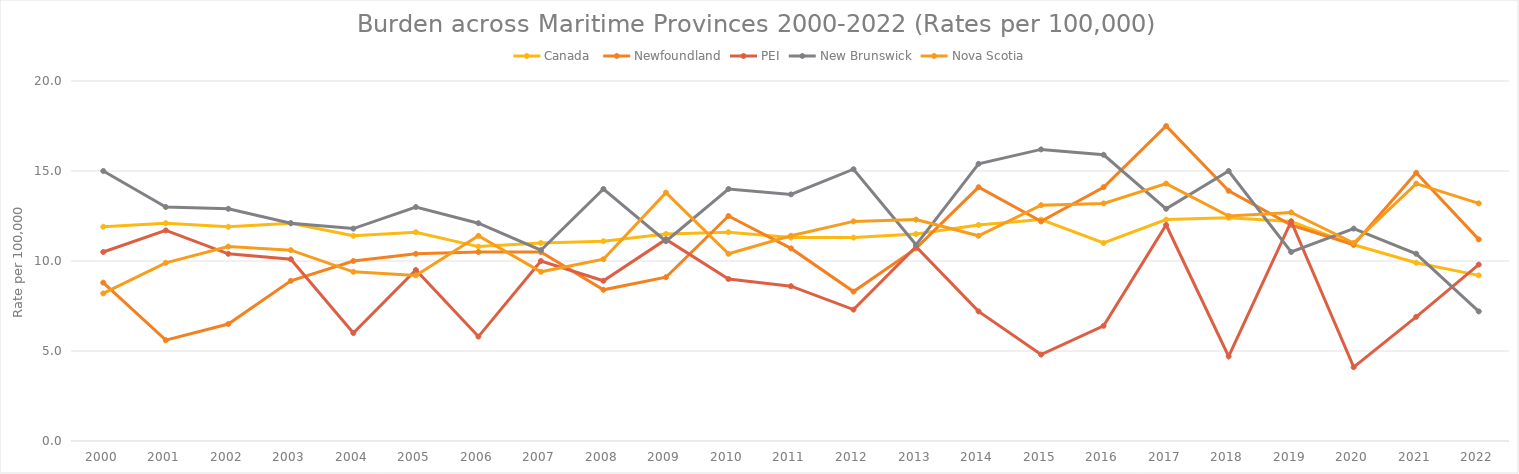
| Category | Canada  | Newfoundland | PEI | New Brunswick | Nova Scotia |
|---|---|---|---|---|---|
| 2000.0 | 11.9 | 8.8 | 10.5 | 15 | 8.2 |
| 2001.0 | 12.1 | 5.6 | 11.7 | 13 | 9.9 |
| 2002.0 | 11.9 | 6.5 | 10.4 | 12.9 | 10.8 |
| 2003.0 | 12.1 | 8.9 | 10.1 | 12.1 | 10.6 |
| 2004.0 | 11.4 | 10 | 6 | 11.8 | 9.4 |
| 2005.0 | 11.6 | 10.4 | 9.5 | 13 | 9.2 |
| 2006.0 | 10.8 | 10.5 | 5.8 | 12.1 | 11.4 |
| 2007.0 | 11 | 10.5 | 10 | 10.6 | 9.4 |
| 2008.0 | 11.1 | 8.4 | 8.9 | 14 | 10.1 |
| 2009.0 | 11.5 | 9.1 | 11.2 | 11.1 | 13.8 |
| 2010.0 | 11.6 | 12.5 | 9 | 14 | 10.4 |
| 2011.0 | 11.3 | 10.7 | 8.6 | 13.7 | 11.4 |
| 2012.0 | 11.3 | 8.3 | 7.3 | 15.1 | 12.2 |
| 2013.0 | 11.5 | 10.7 | 10.8 | 10.9 | 12.3 |
| 2014.0 | 12 | 14.1 | 7.2 | 15.4 | 11.4 |
| 2015.0 | 12.3 | 12.2 | 4.8 | 16.2 | 13.1 |
| 2016.0 | 11 | 14.1 | 6.4 | 15.9 | 13.2 |
| 2017.0 | 12.3 | 17.5 | 12 | 12.9 | 14.3 |
| 2018.0 | 12.4 | 13.9 | 4.7 | 15 | 12.5 |
| 2019.0 | 12.2 | 12 | 12.2 | 10.5 | 12.7 |
| 2020.0 | 10.9 | 10.9 | 4.1 | 11.8 | 11 |
| 2021.0 | 9.9 | 14.9 | 6.9 | 10.4 | 14.3 |
| 2022.0 | 9.2 | 11.2 | 9.8 | 7.2 | 13.2 |